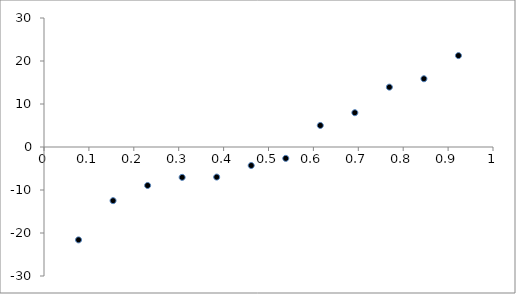
| Category | Series 0 |
|---|---|
| 0.07692307692307693 | -21.6 |
| 0.15384615384615385 | -12.48 |
| 0.23076923076923078 | -8.947 |
| 0.3076923076923077 | -7.06 |
| 0.38461538461538464 | -6.994 |
| 0.46153846153846156 | -4.304 |
| 0.5384615384615384 | -2.647 |
| 0.6153846153846154 | 5.01 |
| 0.6923076923076923 | 7.975 |
| 0.7692307692307693 | 13.919 |
| 0.8461538461538461 | 15.873 |
| 0.9230769230769231 | 21.256 |